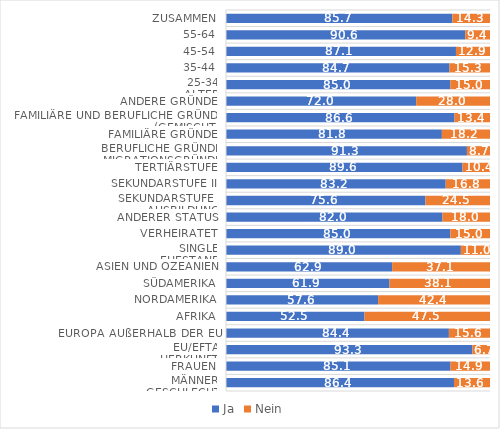
| Category | Ja | Nein |
|---|---|---|
| 0 | 86.36 | 13.64 |
| 1 | 85.06 | 14.94 |
| 2 | 93.33 | 6.67 |
| 3 | 84.43 | 15.57 |
| 4 | 52.46 | 47.54 |
| 5 | 57.63 | 42.37 |
| 6 | 61.94 | 38.06 |
| 7 | 62.93 | 37.07 |
| 8 | 88.96 | 11.04 |
| 9 | 84.99 | 15.01 |
| 10 | 82 | 18 |
| 11 | 75.55 | 24.45 |
| 12 | 83.22 | 16.78 |
| 13 | 89.6 | 10.4 |
| 14 | 91.26 | 8.74 |
| 15 | 81.77 | 18.23 |
| 16 | 86.56 | 13.44 |
| 17 | 72.04 | 27.96 |
| 18 | 84.99 | 15.01 |
| 19 | 84.66 | 15.34 |
| 20 | 87.11 | 12.89 |
| 21 | 90.62 | 9.38 |
| 22 | 85.74 | 14.26 |